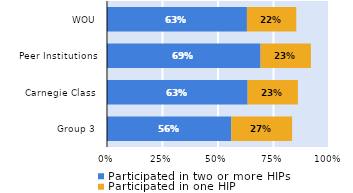
| Category | Participated in two or more HIPs | Participated in one HIP |
|---|---|---|
| Group 3 | 0.56 | 0.274 |
| Carnegie Class | 0.634 | 0.226 |
| Peer Institutions | 0.692 | 0.227 |
| WOU | 0.63 | 0.222 |